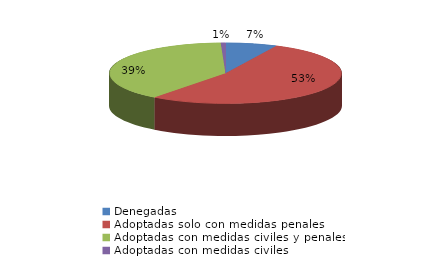
| Category | Series 0 |
|---|---|
| Denegadas | 11 |
| Adoptadas solo con medidas penales | 82 |
| Adoptadas con medidas civiles y penales | 60 |
| Adoptadas con medidas civiles | 1 |